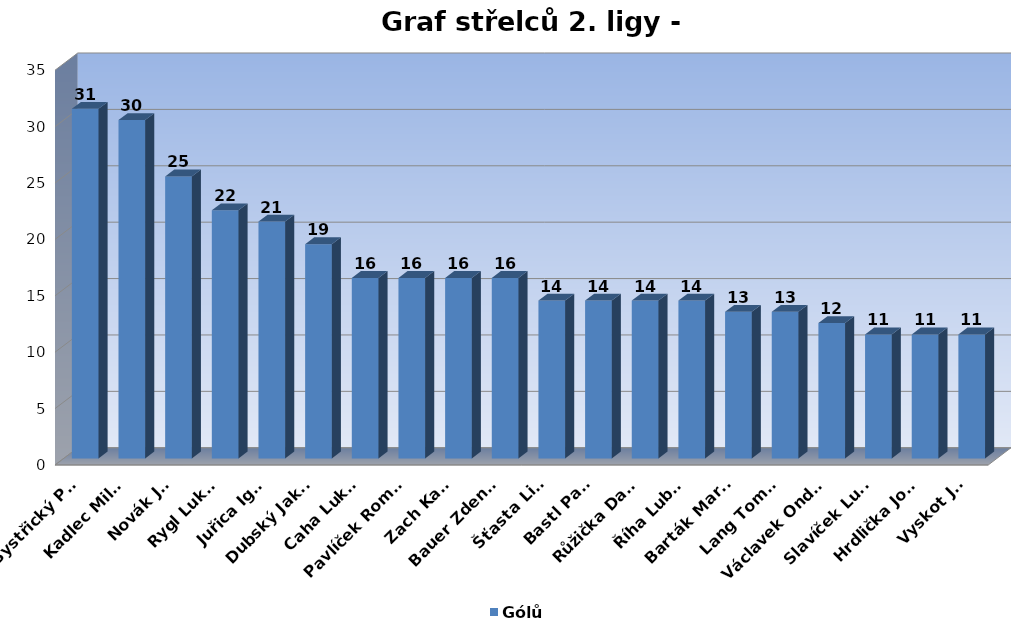
| Category | Gólů |
|---|---|
| Bystřický Petr | 31 |
| Kadlec Milan | 30 |
| Novák Jan | 25 |
| Rygl Lukáš | 22 |
| Juřica Igor | 21 |
| Dubský Jakub | 19 |
| Caha Lukáš | 16 |
| Pavlíček Roman | 16 |
| Zach Karel | 16 |
| Bauer Zdeněk | 16 |
| Šťasta Libor | 14 |
| Bastl Pavel | 14 |
| Růžička David | 14 |
| Říha Luboš | 14 |
| Barták Martin | 13 |
| Lang Tomáš | 13 |
| Václavek Ondřej | 12 |
| Slavíček Lukáš | 11 |
| Hrdlička Josef | 11 |
| Vyskot Jan | 11 |